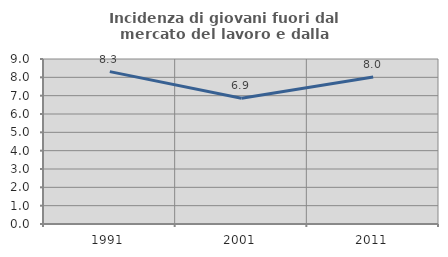
| Category | Incidenza di giovani fuori dal mercato del lavoro e dalla formazione  |
|---|---|
| 1991.0 | 8.312 |
| 2001.0 | 6.855 |
| 2011.0 | 8.017 |